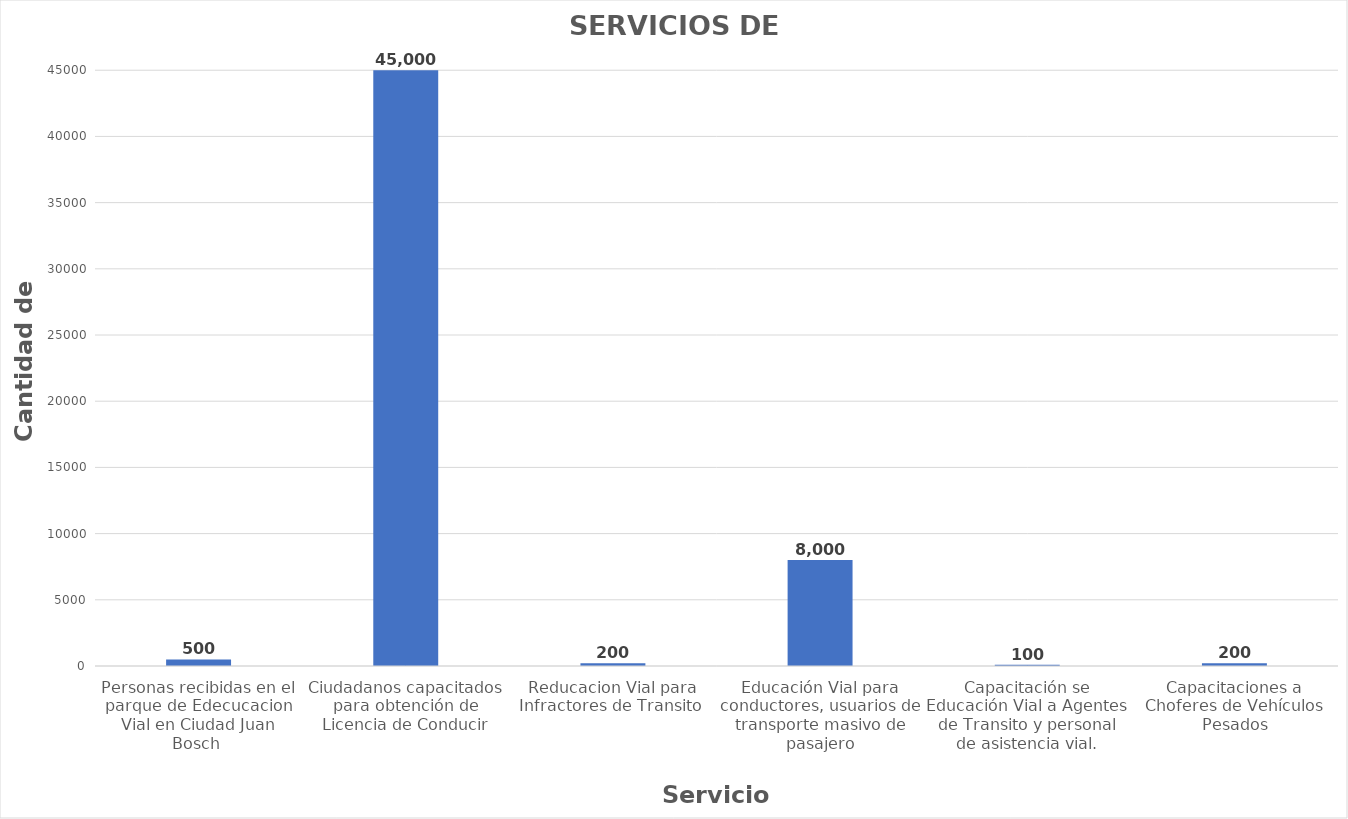
| Category | Series 0 |
|---|---|
| Personas recibidas en el parque de Edecucacion Vial en Ciudad Juan Bosch  | 500 |
| Ciudadanos capacitados para obtención de Licencia de Conducir | 45000 |
| Reducacion Vial para Infractores de Transito  | 200 |
| Educación Vial para conductores, usuarios de transporte masivo de pasajero | 8000 |
| Capacitación se Educación Vial a Agentes de Transito y personal de asistencia vial. | 100 |
| Capacitaciones a Choferes de Vehículos Pesados | 200 |